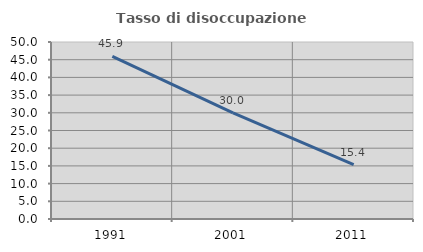
| Category | Tasso di disoccupazione giovanile  |
|---|---|
| 1991.0 | 45.946 |
| 2001.0 | 30 |
| 2011.0 | 15.385 |